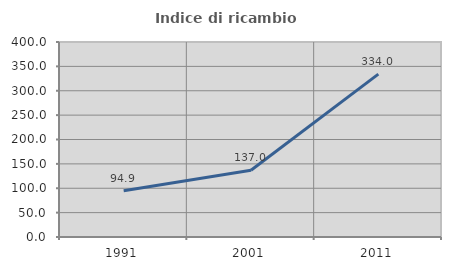
| Category | Indice di ricambio occupazionale  |
|---|---|
| 1991.0 | 94.857 |
| 2001.0 | 136.957 |
| 2011.0 | 334 |